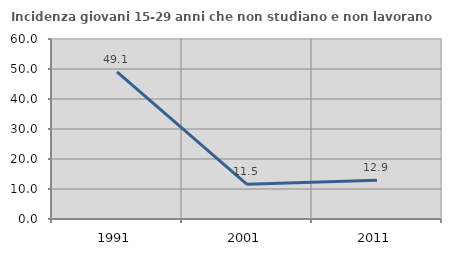
| Category | Incidenza giovani 15-29 anni che non studiano e non lavorano  |
|---|---|
| 1991.0 | 49.068 |
| 2001.0 | 11.549 |
| 2011.0 | 12.899 |